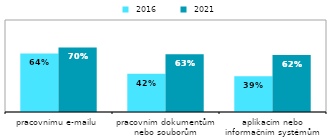
| Category |  2016 |  2021 |
|---|---|---|
| pracovnímu e-mailu | 0.636 | 0.702 |
| pracovním dokumentům nebo souborům | 0.415 | 0.628 |
| aplikacím nebo informačním systémům | 0.388 | 0.62 |